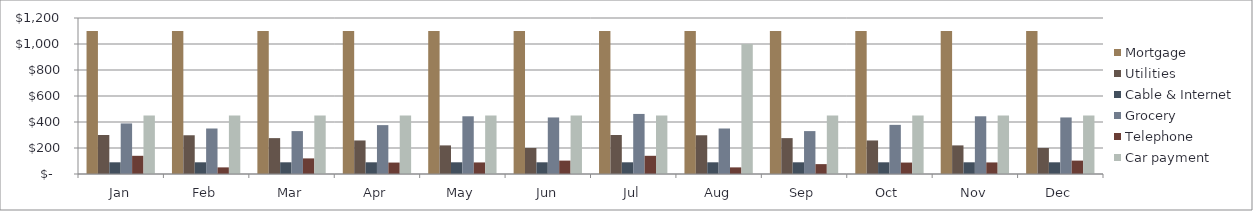
| Category | Mortgage | Utilities | Cable & Internet | Grocery | Telephone | Car payment |
|---|---|---|---|---|---|---|
| Jan | 1100 | 300 | 90 | 389 | 140 | 450 |
| Feb | 1100 | 298 | 90 | 350 | 50.93 | 450 |
| Mar | 1100 | 276 | 90 | 330 | 120 | 450 |
| Apr | 1100 | 258 | 90 | 376 | 88 | 450 |
| May | 1100 | 220 | 90 | 444 | 89 | 450 |
| Jun | 1100 | 200 | 90 | 435 | 103 | 450 |
| Jul | 1100 | 300 | 90 | 462 | 140 | 450 |
| Aug | 1100 | 298 | 90 | 350 | 50.93 | 1000 |
| Sep | 1100 | 276 | 90 | 330 | 76 | 450 |
| Oct | 1100 | 258 | 90 | 378 | 88 | 450 |
| Nov | 1100 | 220 | 90 | 444 | 89 | 450 |
| Dec | 1100 | 200 | 90 | 435 | 103 | 450 |